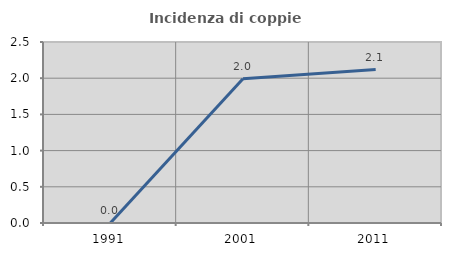
| Category | Incidenza di coppie miste |
|---|---|
| 1991.0 | 0 |
| 2001.0 | 1.993 |
| 2011.0 | 2.119 |